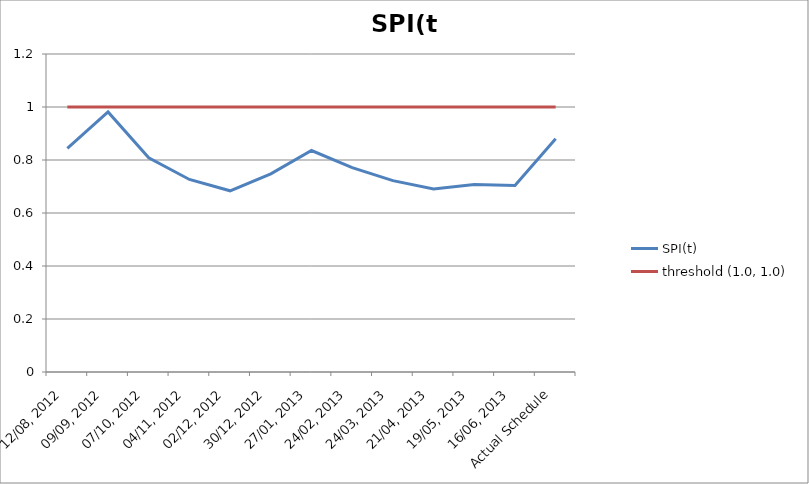
| Category | SPI(t) | threshold (1.0, 1.0) |
|---|---|---|
| 12/08, 2012 | 0.844 | 1 |
| 09/09, 2012 | 0.981 | 1 |
| 07/10, 2012 | 0.808 | 1 |
| 04/11, 2012 | 0.727 | 1 |
| 02/12, 2012 | 0.684 | 1 |
| 30/12, 2012 | 0.748 | 1 |
| 27/01, 2013 | 0.836 | 1 |
| 24/02, 2013 | 0.771 | 1 |
| 24/03, 2013 | 0.722 | 1 |
| 21/04, 2013 | 0.691 | 1 |
| 19/05, 2013 | 0.707 | 1 |
| 16/06, 2013 | 0.704 | 1 |
| Actual Schedule | 0.88 | 1 |